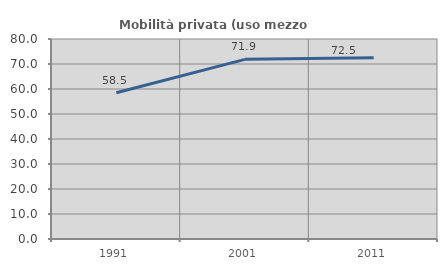
| Category | Mobilità privata (uso mezzo privato) |
|---|---|
| 1991.0 | 58.514 |
| 2001.0 | 71.851 |
| 2011.0 | 72.526 |